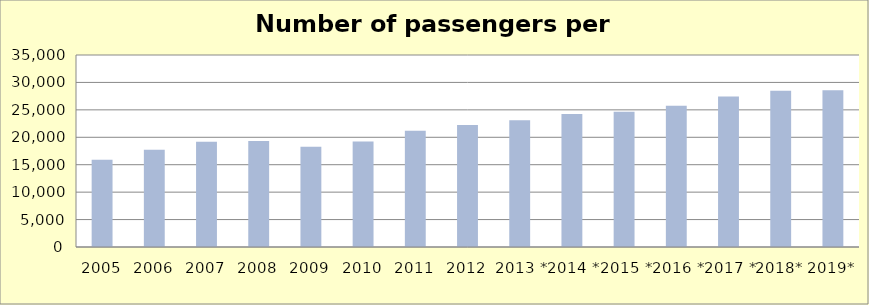
| Category | Series 12 |
|---|---|
| 2005 | 15906.445 |
| 2006 | 17737.61 |
| 2007 | 19169.516 |
| 2008 | 19345.244 |
| 2009 | 18257.317 |
| 2010 | 19231.895 |
| 2011 | 21214.066 |
| 2012 | 22256.338 |
| 2013 * | 23114.811 |
| 2014 * | 24230.18 |
| 2015 * | 24656.759 |
| 2016 * | 25766.246 |
| 2017 * | 27457.597 |
| 2018* | 28501.394 |
| 2019* | 28572.06 |